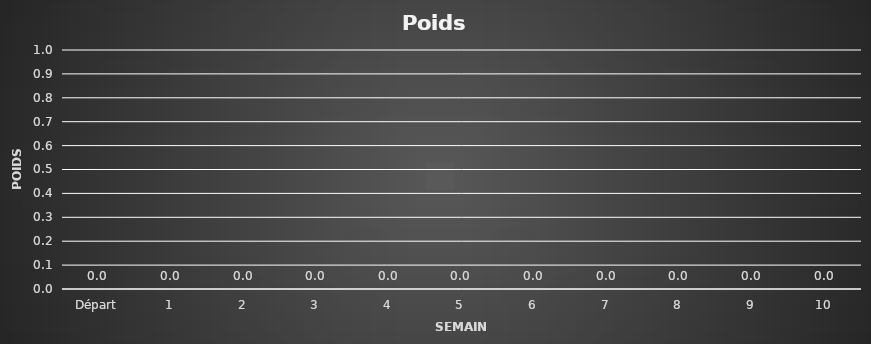
| Category | Poids corporel |
|---|---|
| Départ | 0 |
| 1 | 0 |
| 2 | 0 |
| 3 | 0 |
| 4 | 0 |
| 5 | 0 |
| 6 | 0 |
| 7 | 0 |
| 8 | 0 |
| 9 | 0 |
| 10 | 0 |